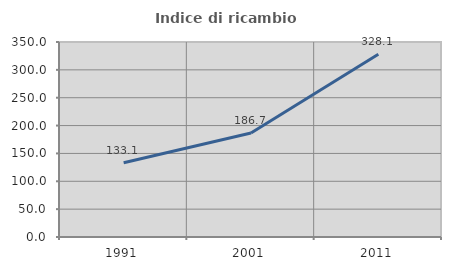
| Category | Indice di ricambio occupazionale  |
|---|---|
| 1991.0 | 133.131 |
| 2001.0 | 186.667 |
| 2011.0 | 328.105 |